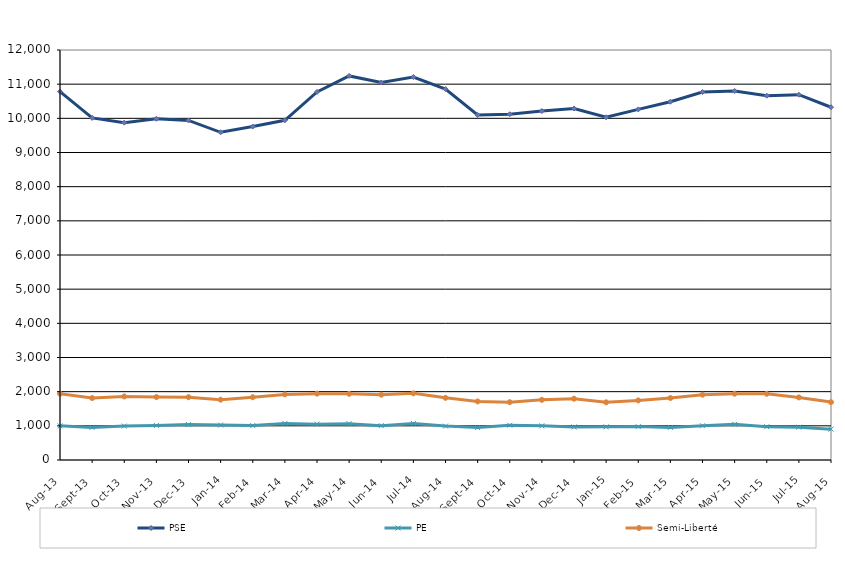
| Category | PSE | PE | Semi-Liberté |
|---|---|---|---|
| 2013-08-01 | 10782 | 999 | 1939 |
| 2013-09-01 | 10013 | 954 | 1813 |
| 2013-10-01 | 9874 | 993 | 1860 |
| 2013-11-01 | 9987 | 1013 | 1842 |
| 2013-12-01 | 9938 | 1037 | 1838 |
| 2014-01-01 | 9591 | 1022 | 1765 |
| 2014-02-01 | 9760 | 1007 | 1838 |
| 2014-03-01 | 9943 | 1071 | 1920 |
| 2014-04-01 | 10773 | 1050 | 1942 |
| 2014-05-01 | 11241 | 1062 | 1937 |
| 2014-06-01 | 11048 | 1005 | 1912 |
| 2014-07-01 | 11210 | 1068 | 1951 |
| 2014-08-01 | 10856 | 992 | 1820 |
| 2014-09-01 | 10098 | 951 | 1714 |
| 2014-10-01 | 10120 | 1018 | 1692 |
| 2014-11-01 | 10213 | 1000 | 1760 |
| 2014-12-01 | 10287 | 966 | 1794 |
| 2015-01-01 | 10030 | 970 | 1689 |
| 2015-02-01 | 10261 | 977 | 1743 |
| 2015-03-01 | 10485 | 954 | 1814 |
| 2015-04-01 | 10770 | 1003 | 1912 |
| 2015-05-01 | 10801 | 1043 | 1941 |
| 2015-06-01 | 10662 | 973 | 1938 |
| 2015-07-01 | 10692 | 961 | 1832 |
| 2015-08-01 | 10325 | 903 | 1694 |